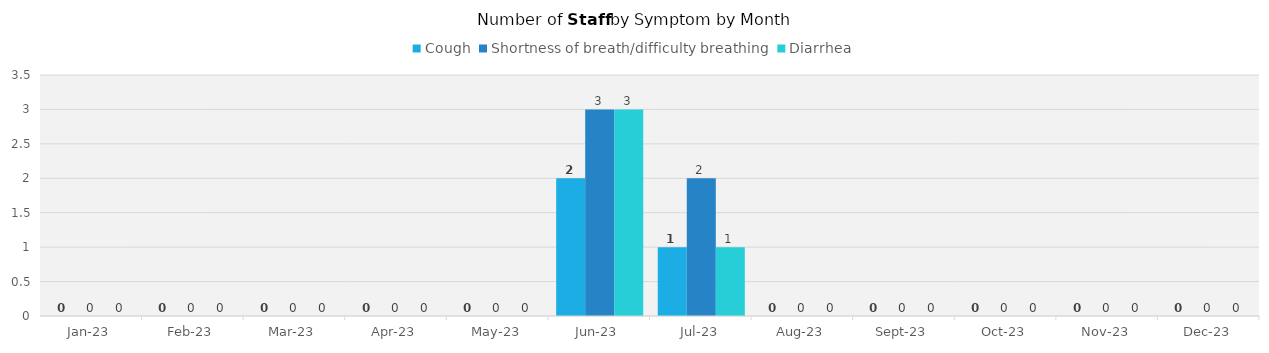
| Category | Cough | Shortness of breath/difficulty breathing | Diarrhea |
|---|---|---|---|
| 2023-01-01 | 0 | 0 | 0 |
| 2023-02-01 | 0 | 0 | 0 |
| 2023-03-01 | 0 | 0 | 0 |
| 2023-04-01 | 0 | 0 | 0 |
| 2023-05-01 | 0 | 0 | 0 |
| 2023-06-01 | 2 | 3 | 3 |
| 2023-07-01 | 1 | 2 | 1 |
| 2023-08-01 | 0 | 0 | 0 |
| 2023-09-01 | 0 | 0 | 0 |
| 2023-10-01 | 0 | 0 | 0 |
| 2023-11-01 | 0 | 0 | 0 |
| 2023-12-01 | 0 | 0 | 0 |